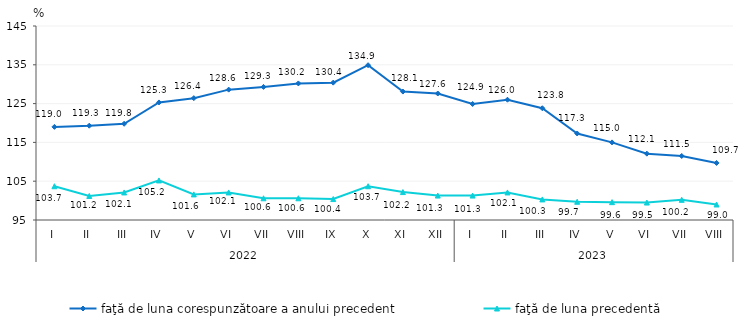
| Category | faţă de luna corespunzătoare a anului precedent | faţă de luna precedentă   |
|---|---|---|
| 0 | 119 | 103.7 |
| 1 | 119.3 | 101.2 |
| 2 | 119.8 | 102.1 |
| 3 | 125.3 | 105.2 |
| 4 | 126.4 | 101.6 |
| 5 | 128.6 | 102.1 |
| 6 | 129.3 | 100.6 |
| 7 | 130.2 | 100.6 |
| 8 | 130.4 | 100.4 |
| 9 | 134.9 | 103.7 |
| 10 | 128.1 | 102.2 |
| 11 | 127.6 | 101.3 |
| 12 | 124.9 | 101.3 |
| 13 | 126 | 102.1 |
| 14 | 123.8 | 100.3 |
| 15 | 117.3 | 99.7 |
| 16 | 115 | 99.6 |
| 17 | 112.1 | 99.5 |
| 18 | 111.5 | 100.2 |
| 19 | 109.7 | 99 |